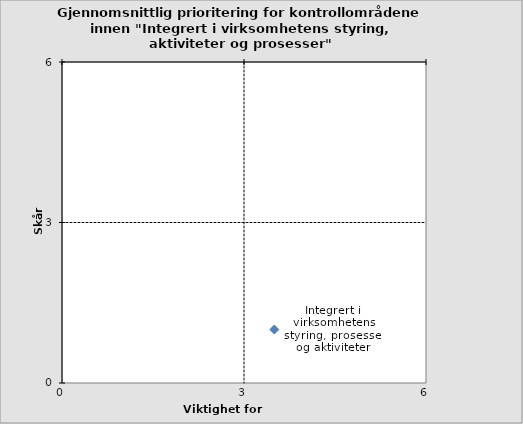
| Category | Integrert i virksomhetens styring, prosesser og aktiviteter |
|---|---|
| 3.5 | 1 |